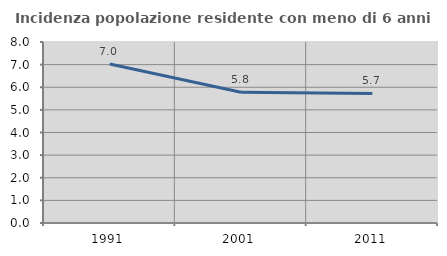
| Category | Incidenza popolazione residente con meno di 6 anni |
|---|---|
| 1991.0 | 7.029 |
| 2001.0 | 5.782 |
| 2011.0 | 5.726 |